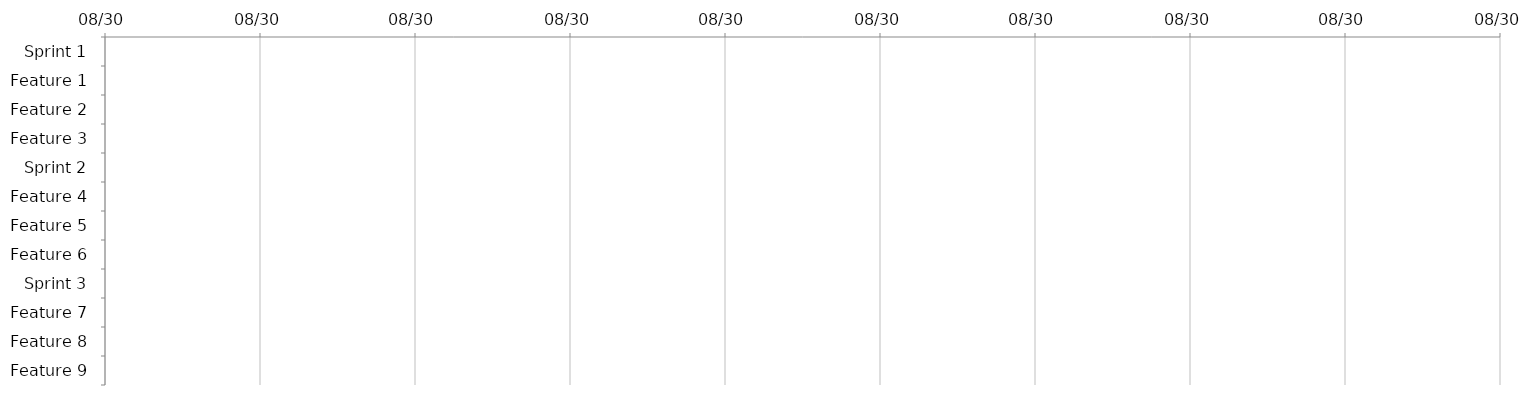
| Category | START | DAYS |
|---|---|---|
| Sprint 1 |  | 0 |
| Feature 1 |  | 0 |
| Feature 2 |  | 0 |
| Feature 3 |  | 0 |
| Sprint 2 |  | 0 |
| Feature 4 |  | 0 |
| Feature 5 |  | 0 |
| Feature 6 |  | 0 |
| Sprint 3 |  | 0 |
| Feature 7 |  | 0 |
| Feature 8 |  | 0 |
| Feature 9 |  | 0 |